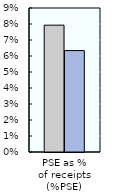
| Category | 2000-02 | 2018-20 |
|---|---|---|
| PSE as %
of receipts (%PSE) | 0.079 | 0.063 |